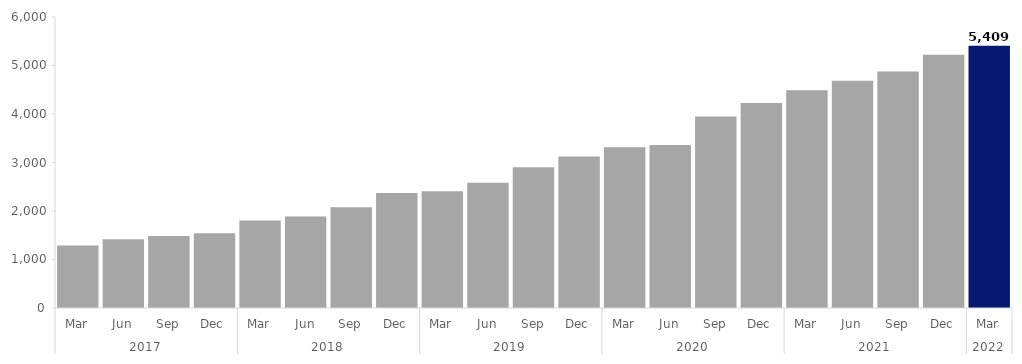
| Category | Series 0 |
|---|---|
| 0 | 1290 |
| 1 | 1419 |
| 2 | 1482 |
| 3 | 1542 |
| 4 | 1806 |
| 5 | 1887 |
| 6 | 2076 |
| 7 | 2373 |
| 8 | 2406 |
| 9 | 2580 |
| 10 | 2901 |
| 11 | 3126 |
| 12 | 3312 |
| 13 | 3360 |
| 14 | 3948 |
| 15 | 4227 |
| 16 | 4488 |
| 17 | 4686 |
| 18 | 4875 |
| 19 | 5223 |
| 20 | 5409 |